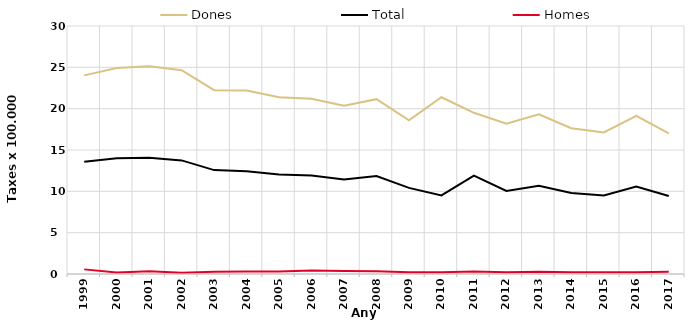
| Category | Dones | Total | Homes |
|---|---|---|---|
| 1999.0 | 24.03 | 13.58 | 0.56 |
| 2000.0 | 24.92 | 13.99 | 0.19 |
| 2001.0 | 25.14 | 14.07 | 0.33 |
| 2002.0 | 24.65 | 13.74 | 0.14 |
| 2003.0 | 22.24 | 12.57 | 0.28 |
| 2004.0 | 22.2 | 12.44 | 0.3 |
| 2005.0 | 21.39 | 12.03 | 0.3 |
| 2006.0 | 21.19 | 11.91 | 0.43 |
| 2007.0 | 20.35 | 11.44 | 0.37 |
| 2008.0 | 21.15 | 11.85 | 0.34 |
| 2009.0 | 18.59 | 10.42 | 0.2 |
| 2010.0 | 21.38 | 9.5 | 0.2 |
| 2011.0 | 19.5 | 11.91 | 0.29 |
| 2012.0 | 18.17 | 10.05 | 0.2 |
| 2013.0 | 19.31 | 10.67 | 0.26 |
| 2014.0 | 17.64 | 9.79 | 0.22 |
| 2015.0 | 17.13 | 9.5 | 0.2 |
| 2016.0 | 19.14 | 10.59 | 0.2 |
| 2017.0 | 17.01 | 9.44 | 0.28 |